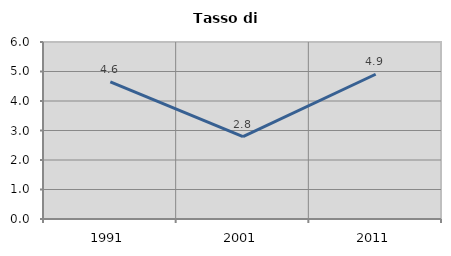
| Category | Tasso di disoccupazione   |
|---|---|
| 1991.0 | 4.649 |
| 2001.0 | 2.795 |
| 2011.0 | 4.907 |